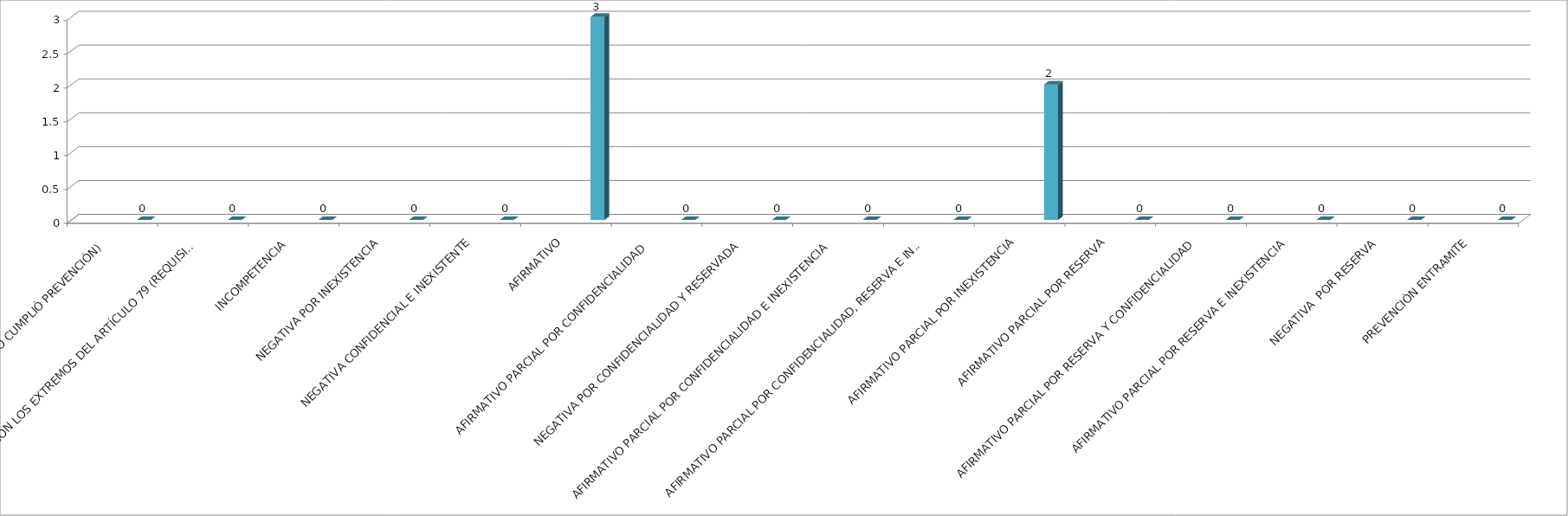
| Category | Series 0 | Series 1 | Series 2 | Series 3 | Series 4 |
|---|---|---|---|---|---|
| SE TIENE POR NO PRESENTADA ( NO CUMPLIÓ PREVENCIÓN) |  |  |  |  | 0 |
| NO CUMPLIO CON LOS EXTREMOS DEL ARTÍCULO 79 (REQUISITOS) |  |  |  |  | 0 |
| INCOMPETENCIA  |  |  |  |  | 0 |
| NEGATIVA POR INEXISTENCIA |  |  |  |  | 0 |
| NEGATIVA CONFIDENCIAL E INEXISTENTE |  |  |  |  | 0 |
| AFIRMATIVO |  |  |  |  | 3 |
| AFIRMATIVO PARCIAL POR CONFIDENCIALIDAD  |  |  |  |  | 0 |
| NEGATIVA POR CONFIDENCIALIDAD Y RESERVADA |  |  |  |  | 0 |
| AFIRMATIVO PARCIAL POR CONFIDENCIALIDAD E INEXISTENCIA |  |  |  |  | 0 |
| AFIRMATIVO PARCIAL POR CONFIDENCIALIDAD, RESERVA E INEXISTENCIA |  |  |  |  | 0 |
| AFIRMATIVO PARCIAL POR INEXISTENCIA |  |  |  |  | 2 |
| AFIRMATIVO PARCIAL POR RESERVA |  |  |  |  | 0 |
| AFIRMATIVO PARCIAL POR RESERVA Y CONFIDENCIALIDAD |  |  |  |  | 0 |
| AFIRMATIVO PARCIAL POR RESERVA E INEXISTENCIA |  |  |  |  | 0 |
| NEGATIVA  POR RESERVA |  |  |  |  | 0 |
| PREVENCIÓN ENTRAMITE |  |  |  |  | 0 |